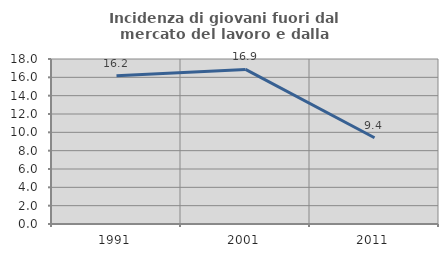
| Category | Incidenza di giovani fuori dal mercato del lavoro e dalla formazione  |
|---|---|
| 1991.0 | 16.184 |
| 2001.0 | 16.86 |
| 2011.0 | 9.412 |